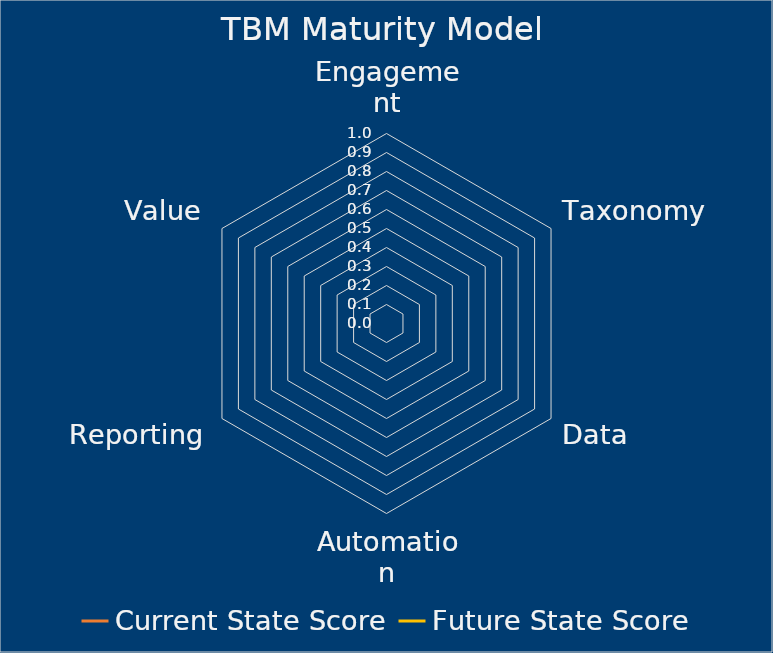
| Category | Current State Score | Future State Score |
|---|---|---|
| Engagement | 0 | 0 |
| Taxonomy | 0 | 0 |
| Data | 0 | 0 |
| Automation | 0 | 0 |
| Reporting | 0 | 0 |
| Value | 0 | 0 |